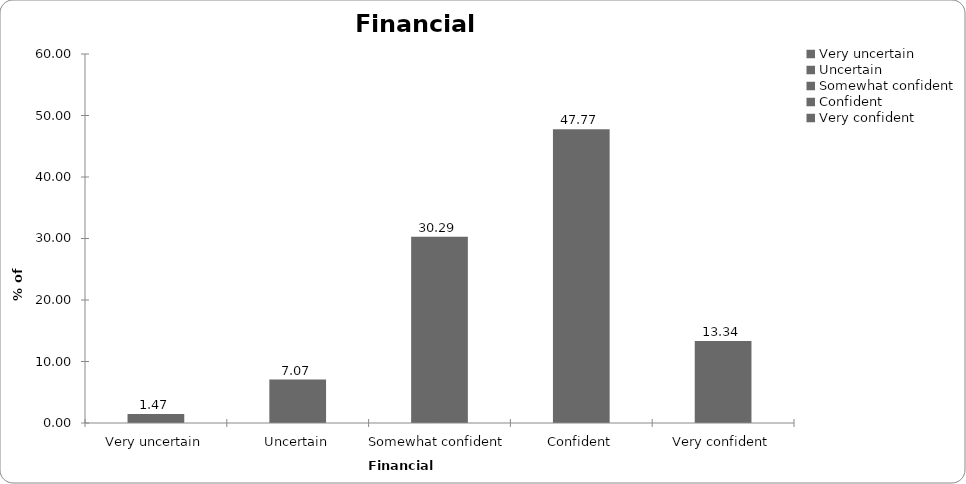
| Category | Financial confidence |
|---|---|
| Very uncertain | 1.468 |
| Uncertain | 7.071 |
| Somewhat confident | 30.287 |
| Confident | 47.765 |
| Very confident | 13.342 |